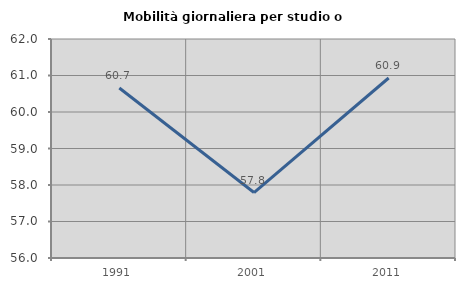
| Category | Mobilità giornaliera per studio o lavoro |
|---|---|
| 1991.0 | 60.657 |
| 2001.0 | 57.794 |
| 2011.0 | 60.931 |